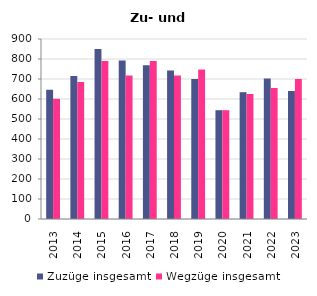
| Category | Zuzüge insgesamt | Wegzüge insgesamt |
|---|---|---|
| 2013.0 | 646 | 601 |
| 2014.0 | 715 | 685 |
| 2015.0 | 850 | 790 |
| 2016.0 | 793 | 718 |
| 2017.0 | 769 | 790 |
| 2018.0 | 742 | 718 |
| 2019.0 | 700 | 748 |
| 2020.0 | 544 | 544 |
| 2021.0 | 634 | 625 |
| 2022.0 | 703 | 655 |
| 2023.0 | 640 | 700 |